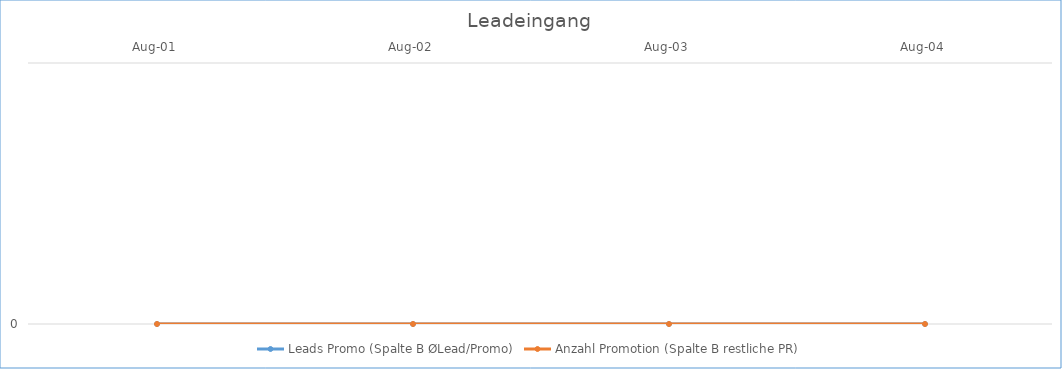
| Category | Leads Promo (Spalte B ØLead/Promo) | Anzahl Promotion (Spalte B restliche PR) |
|---|---|---|
| 2001-08-01 | 0 | 0 |
| 2002-08-01 | 0 | 0 |
| 2003-08-01 | 0 | 0 |
| 2004-08-01 | 0 | 0 |